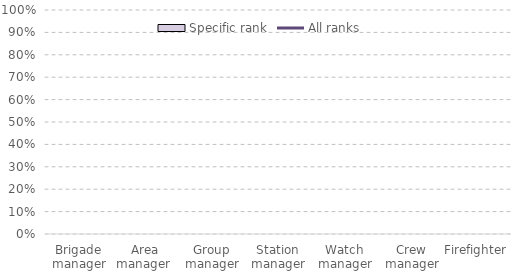
| Category | Specific rank |
|---|---|
| Brigade manager | 0 |
| Area manager  | 0 |
| Group manager | 0 |
| Station manager | 0 |
| Watch manager | 0 |
| Crew manager | 0 |
| Firefighter | 0 |